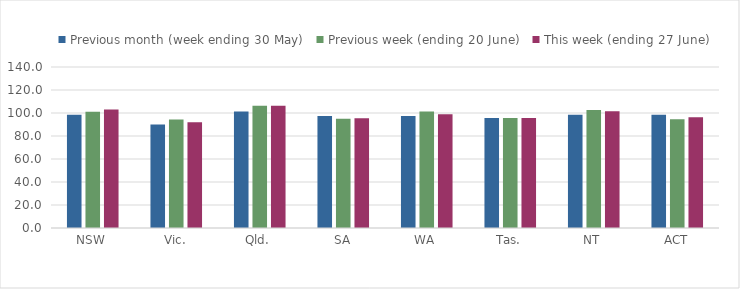
| Category | Previous month (week ending 30 May) | Previous week (ending 20 June) | This week (ending 27 June) |
|---|---|---|---|
| NSW | 98.448 | 101.007 | 102.945 |
| Vic. | 89.984 | 94.332 | 91.934 |
| Qld. | 101.233 | 106.226 | 106.226 |
| SA | 97.295 | 95.053 | 95.53 |
| WA | 97.49 | 101.389 | 98.909 |
| Tas. | 95.659 | 95.659 | 95.659 |
| NT | 98.528 | 102.614 | 101.573 |
| ACT | 98.541 | 94.52 | 96.234 |